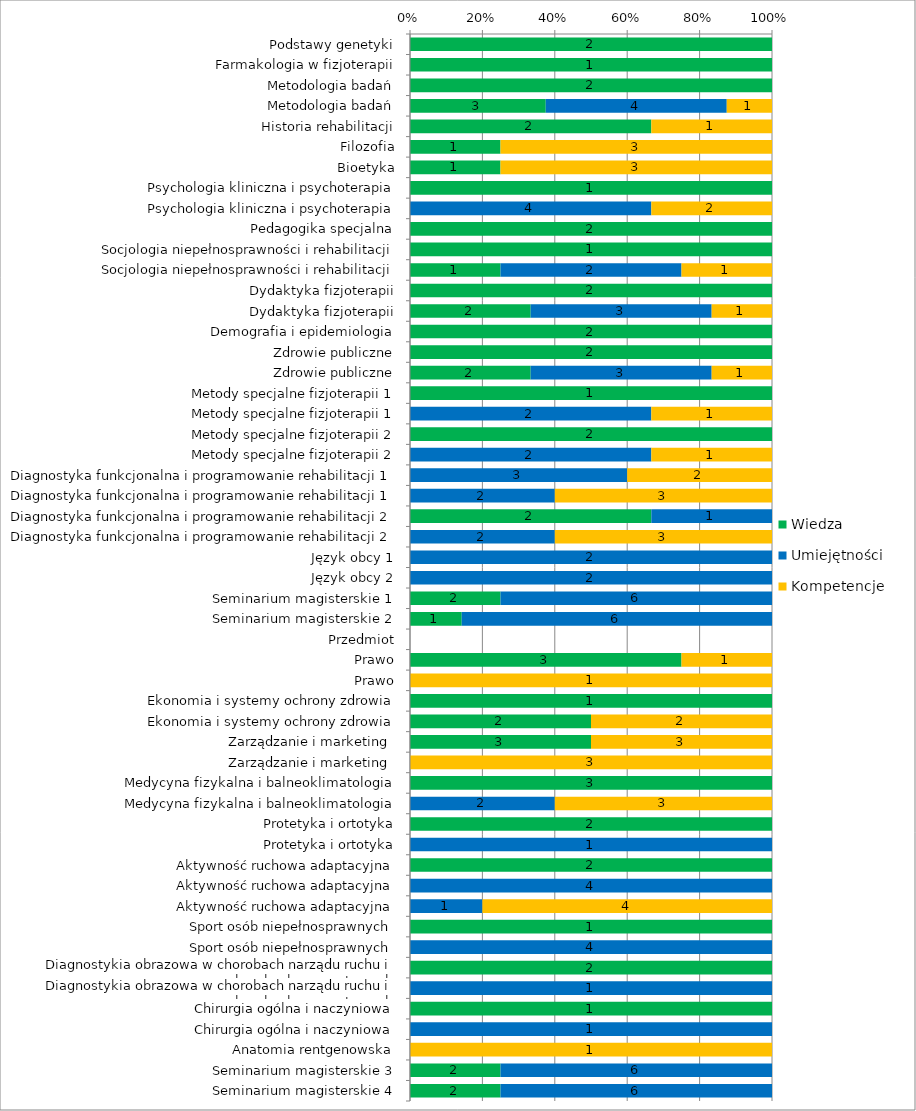
| Category | Wiedza | Umiejętności | Kompetencje |
|---|---|---|---|
| Podstawy genetyki | 2 | 0 | 0 |
| Farmakologia w fizjoterapii | 1 | 0 | 0 |
| Metodologia badań | 2 | 0 | 0 |
| Metodologia badań | 3 | 4 | 1 |
| Historia rehabilitacji | 2 | 0 | 1 |
| Filozofia | 1 | 0 | 3 |
| Bioetyka | 1 | 0 | 3 |
| Psychologia kliniczna i psychoterapia | 1 | 0 | 0 |
| Psychologia kliniczna i psychoterapia | 0 | 4 | 2 |
| Pedagogika specjalna | 2 | 0 | 0 |
| Socjologia niepełnosprawności i rehabilitacji | 1 | 0 | 0 |
| Socjologia niepełnosprawności i rehabilitacji | 1 | 2 | 1 |
| Dydaktyka fizjoterapii | 2 | 0 | 0 |
| Dydaktyka fizjoterapii | 2 | 3 | 1 |
| Demografia i epidemiologia | 2 | 0 | 0 |
| Zdrowie publiczne | 2 | 0 | 0 |
| Zdrowie publiczne | 2 | 3 | 1 |
| Metody specjalne fizjoterapii 1 | 1 | 0 | 0 |
| Metody specjalne fizjoterapii 1 | 0 | 2 | 1 |
| Metody specjalne fizjoterapii 2 | 2 | 0 | 0 |
| Metody specjalne fizjoterapii 2 | 0 | 2 | 1 |
| Diagnostyka funkcjonalna i programowanie rehabilitacji 1 | 0 | 3 | 2 |
| Diagnostyka funkcjonalna i programowanie rehabilitacji 1 | 0 | 2 | 3 |
| Diagnostyka funkcjonalna i programowanie rehabilitacji 2 | 2 | 1 | 0 |
| Diagnostyka funkcjonalna i programowanie rehabilitacji 2 | 0 | 2 | 3 |
| Język obcy 1 | 0 | 2 | 0 |
| Język obcy 2 | 0 | 2 | 0 |
| Seminarium magisterskie 1 | 2 | 6 | 0 |
| Seminarium magisterskie 2 | 1 | 6 | 0 |
| Przedmiot | 0 | 0 | 0 |
| Prawo | 3 | 0 | 1 |
| Prawo | 0 | 0 | 1 |
| Ekonomia i systemy ochrony zdrowia | 1 | 0 | 0 |
| Ekonomia i systemy ochrony zdrowia | 2 | 0 | 2 |
| Zarządzanie i marketing  | 3 | 0 | 3 |
| Zarządzanie i marketing  | 0 | 0 | 3 |
| Medycyna fizykalna i balneoklimatologia | 3 | 0 | 0 |
| Medycyna fizykalna i balneoklimatologia | 0 | 2 | 3 |
| Protetyka i ortotyka | 2 | 0 | 0 |
| Protetyka i ortotyka | 0 | 1 | 0 |
| Aktywność ruchowa adaptacyjna | 2 | 0 | 0 |
| Aktywność ruchowa adaptacyjna | 0 | 4 | 0 |
| Aktywność ruchowa adaptacyjna | 0 | 1 | 4 |
| Sport osób niepełnosprawnych | 1 | 0 | 0 |
| Sport osób niepełnosprawnych | 0 | 4 | 0 |
| Diagnostykia obrazowa w chorobach narządu ruchu i chorobach wewnętrznych | 2 | 0 | 0 |
| Diagnostykia obrazowa w chorobach narządu ruchu i chorobach wewnętrznych | 0 | 1 | 0 |
| Chirurgia ogólna i naczyniowa | 1 | 0 | 0 |
| Chirurgia ogólna i naczyniowa | 0 | 1 | 0 |
| Anatomia rentgenowska | 0 | 0 | 1 |
| Seminarium magisterskie 3 | 2 | 6 | 0 |
| Seminarium magisterskie 4 | 2 | 6 | 0 |